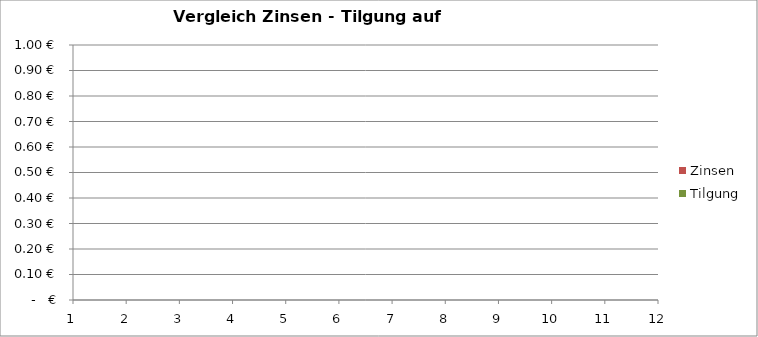
| Category | Tilgung | Zinsen |
|---|---|---|
| 0 | 0 | 0 |
| 1 | 0 | 0 |
| 2 | 0 | 0 |
| 3 | 0 | 0 |
| 4 | 0 | 0 |
| 5 | 0 | 0 |
| 6 | 0 | 0 |
| 7 | 0 | 0 |
| 8 | 0 | 0 |
| 9 | 0 | 0 |
| 10 | 0 | 0 |
| 11 | 0 | 0 |